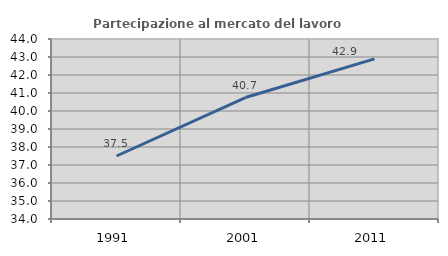
| Category | Partecipazione al mercato del lavoro  femminile |
|---|---|
| 1991.0 | 37.5 |
| 2001.0 | 40.747 |
| 2011.0 | 42.898 |